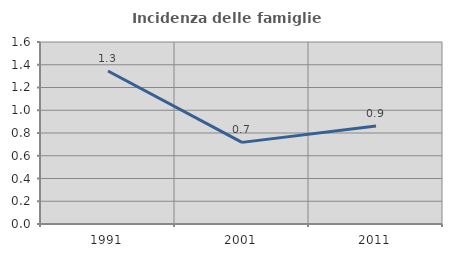
| Category | Incidenza delle famiglie numerose |
|---|---|
| 1991.0 | 1.345 |
| 2001.0 | 0.718 |
| 2011.0 | 0.861 |